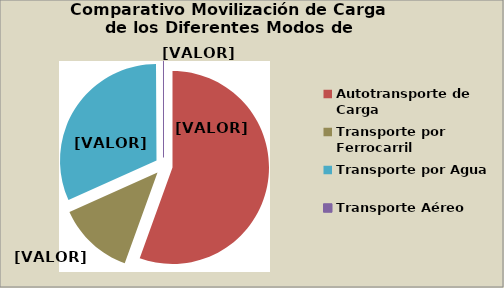
| Category | Series 0 |
|---|---|
| Autotransporte de Carga | 55.514 |
| Transporte por Ferrocarril | 12.775 |
| Transporte por Agua | 31.629 |
| Transporte Aéreo | 0.083 |